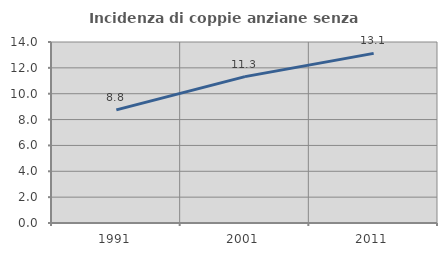
| Category | Incidenza di coppie anziane senza figli  |
|---|---|
| 1991.0 | 8.752 |
| 2001.0 | 11.321 |
| 2011.0 | 13.121 |